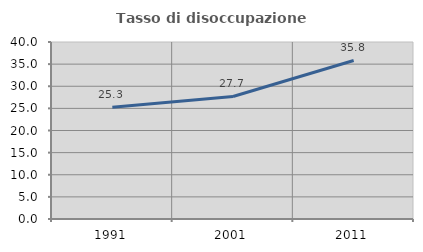
| Category | Tasso di disoccupazione giovanile  |
|---|---|
| 1991.0 | 25.253 |
| 2001.0 | 27.692 |
| 2011.0 | 35.821 |